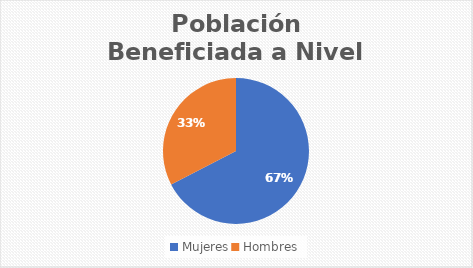
| Category | Series 0 |
|---|---|
| Mujeres | 60 |
| Hombres | 29 |